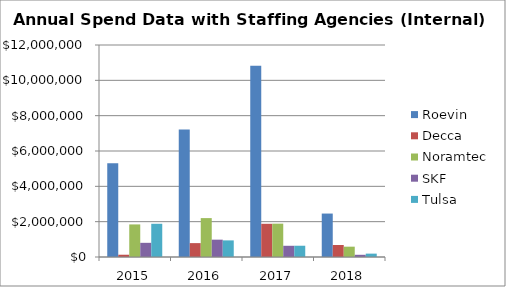
| Category | Roevin  | Decca | Noramtec | SKF | Tulsa |
|---|---|---|---|---|---|
| 2015.0 | 5306331.57 | 128434.6 | 1843995.41 | 802076.26 | 1880722.08 |
| 2016.0 | 7222911.42 | 785882.46 | 2201544.64 | 981248.65 | 940204.61 |
| 2017.0 | 10822998.08 | 1880093.28 | 1887374.94 | 635047.41 | 637539.8 |
| 2018.0 | 2459181.79 | 680682.64 | 584520.6 | 124899.08 | 190534.51 |